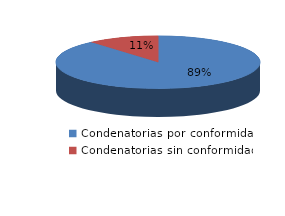
| Category | Series 0 |
|---|---|
| 0 | 55 |
| 1 | 7 |